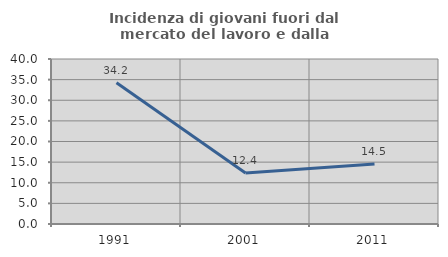
| Category | Incidenza di giovani fuori dal mercato del lavoro e dalla formazione  |
|---|---|
| 1991.0 | 34.223 |
| 2001.0 | 12.36 |
| 2011.0 | 14.516 |